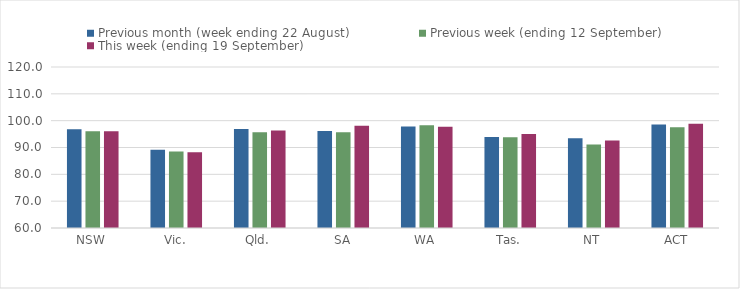
| Category | Previous month (week ending 22 August) | Previous week (ending 12 September) | This week (ending 19 September) |
|---|---|---|---|
| NSW | 96.78 | 96.02 | 96.1 |
| Vic. | 89.16 | 88.49 | 88.19 |
| Qld. | 96.93 | 95.72 | 96.36 |
| SA | 96.15 | 95.68 | 98.15 |
| WA | 97.85 | 98.32 | 97.74 |
| Tas. | 93.9 | 93.8 | 95.04 |
| NT | 93.47 | 91.09 | 92.59 |
| ACT | 98.56 | 97.55 | 98.83 |